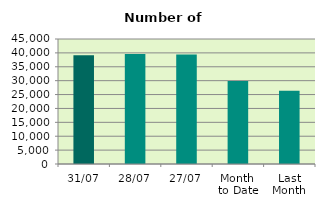
| Category | Series 0 |
|---|---|
| 31/07 | 39154 |
| 28/07 | 39624 |
| 27/07 | 39386 |
| Month 
to Date | 29864.476 |
| Last
Month | 26399.455 |